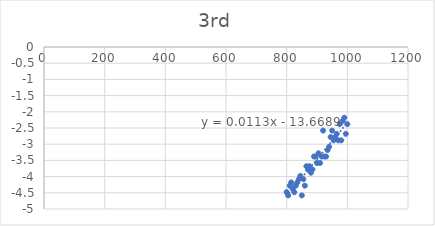
| Category | Series 0 |
|---|---|
| 800.0 | -4.48 |
| 805.0 | -4.58 |
| 810.0 | -4.28 |
| 815.0 | -4.18 |
| 820.0 | -4.38 |
| 825.0 | -4.48 |
| 830.0 | -4.28 |
| 835.0 | -4.18 |
| 840.0 | -4.08 |
| 845.0 | -3.98 |
| 850.0 | -4.58 |
| 855.0 | -4.08 |
| 860.0 | -4.28 |
| 865.0 | -3.68 |
| 870.0 | -3.78 |
| 875.0 | -3.68 |
| 880.0 | -3.88 |
| 885.0 | -3.78 |
| 890.0 | -3.38 |
| 895.0 | -3.38 |
| 900.0 | -3.58 |
| 905.0 | -3.28 |
| 910.0 | -3.58 |
| 915.0 | -3.38 |
| 920.0 | -2.58 |
| 925.0 | -3.38 |
| 930.0 | -3.38 |
| 935.0 | -3.18 |
| 940.0 | -3.08 |
| 945.0 | -2.78 |
| 950.0 | -2.58 |
| 955.0 | -2.88 |
| 960.0 | -2.78 |
| 965.0 | -2.68 |
| 970.0 | -2.88 |
| 975.0 | -2.38 |
| 980.0 | -2.88 |
| 985.0 | -2.28 |
| 990.0 | -2.18 |
| 995.0 | -2.68 |
| 1000.0 | -2.38 |